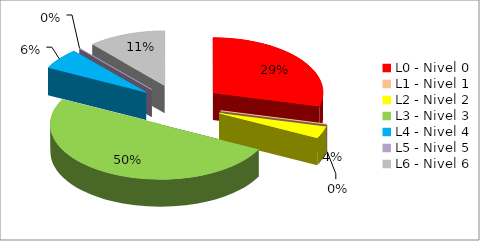
| Category | Series 0 |
|---|---|
| L0 - Nivel 0 | 33 |
| L1 - Nivel 1 | 0 |
| L2 - Nivel 2 | 4 |
| L3 - Nivel 3 | 57 |
| L4 - Nivel 4 | 7 |
| L5 - Nivel 5 | 0 |
| L6 - Nivel 6 | 13 |